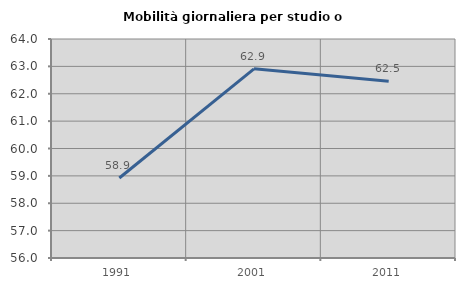
| Category | Mobilità giornaliera per studio o lavoro |
|---|---|
| 1991.0 | 58.922 |
| 2001.0 | 62.909 |
| 2011.0 | 62.452 |